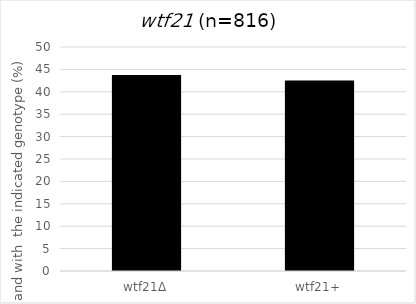
| Category | spores that are viable and with the indicated genotype |
|---|---|
| wtf21Δ | 43.75 |
| wtf21+ | 42.525 |